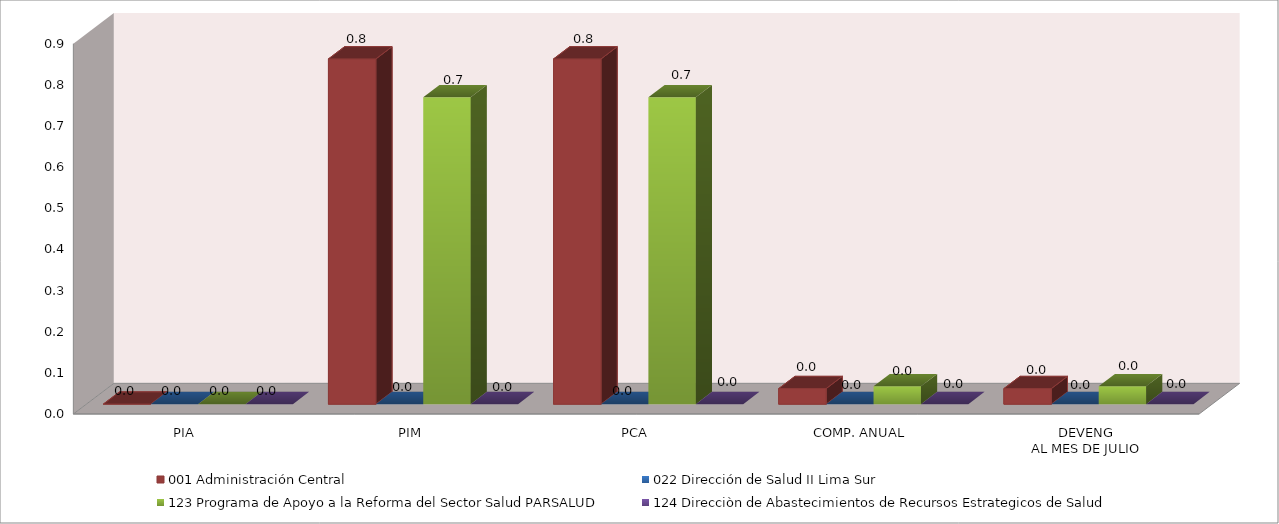
| Category | 001 Administración Central | 022 Dirección de Salud II Lima Sur | 123 Programa de Apoyo a la Reforma del Sector Salud PARSALUD | 124 Direcciòn de Abastecimientos de Recursos Estrategicos de Salud |
|---|---|---|---|---|
| PIA | 0 | 0 | 0 | 0 |
| PIM | 0.839 | 0 | 0.746 | 0 |
| PCA | 0.839 | 0 | 0.746 | 0 |
| COMP. ANUAL | 0.038 | 0 | 0.043 | 0 |
| DEVENG
AL MES DE JULIO | 0.038 | 0 | 0.043 | 0 |